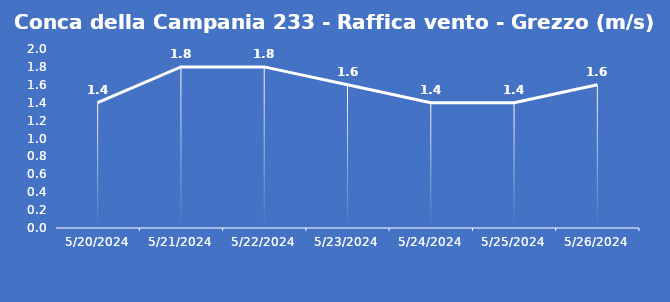
| Category | Conca della Campania 233 - Raffica vento - Grezzo (m/s) |
|---|---|
| 5/20/24 | 1.4 |
| 5/21/24 | 1.8 |
| 5/22/24 | 1.8 |
| 5/23/24 | 1.6 |
| 5/24/24 | 1.4 |
| 5/25/24 | 1.4 |
| 5/26/24 | 1.6 |